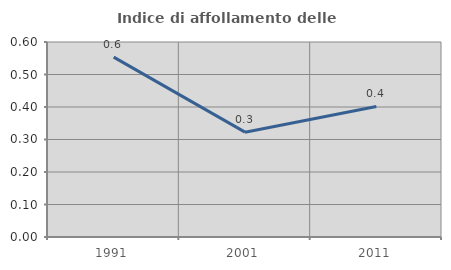
| Category | Indice di affollamento delle abitazioni  |
|---|---|
| 1991.0 | 0.554 |
| 2001.0 | 0.323 |
| 2011.0 | 0.402 |